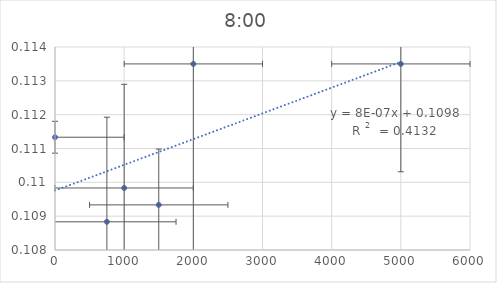
| Category | Series 0 |
|---|---|
| 750.0 | 0.109 |
| 1000.0 | 0.11 |
| 1500.0 | 0.109 |
| 2000.0 | 0.114 |
| 5000.0 | 0.114 |
| 0.0 | 0.111 |